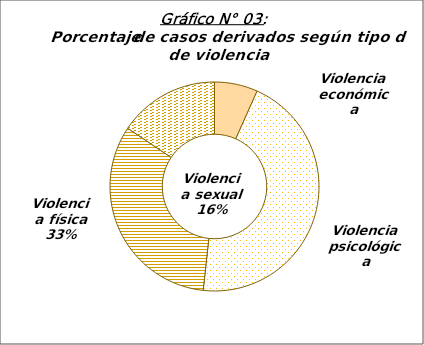
| Category | Series 0 |
|---|---|
| Violencia económica | 54 |
| Violencia psicológica | 364 |
| Violencia física | 264 |
| Violencia sexual | 126 |